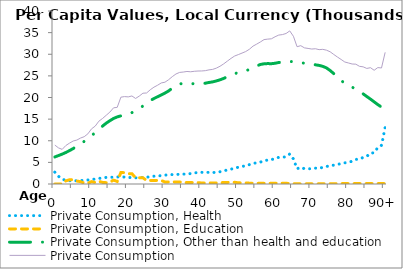
| Category | Private Consumption, Health | Private Consumption, Education | Private Consumption, Other than health and education | Private Consumption |
|---|---|---|---|---|
| 0 | 2738.482 | 0 | 6258.492 | 8996.976 |
|  | 1773.469 | 0 | 6574.999 | 8348.468 |
| 2 | 1097.007 | 0 | 6909.896 | 8006.904 |
| 3 | 880.912 | 724.705 | 7289.234 | 8894.852 |
| 4 | 746.239 | 982.514 | 7722.562 | 9451.315 |
| 5 | 746.797 | 996.976 | 8195.574 | 9939.347 |
| 6 | 756.202 | 685.112 | 8715.884 | 10157.2 |
| 7 | 807.92 | 540.49 | 9273.517 | 10621.93 |
| 8 | 856.985 | 224.862 | 9853.873 | 10935.72 |
| 9 | 934.414 | 175.884 | 10485.286 | 11595.58 |
| 10 | 1021.582 | 550.128 | 11183.636 | 12755.35 |
| 11 | 1158.002 | 348.943 | 11877.139 | 13384.08 |
| 12 | 1282.371 | 616.836 | 12630.732 | 14529.94 |
| 13 | 1393.094 | 371.239 | 13384.631 | 15148.96 |
| 14 | 1516.921 | 309.304 | 14062.706 | 15888.93 |
| 15 | 1556.655 | 436.73 | 14632.773 | 16626.15 |
| 16 | 1572.266 | 886.17 | 15154.454 | 17612.89 |
| 17 | 1618.371 | 595.545 | 15512.457 | 17726.37 |
| 18 | 1667.601 | 2647.913 | 15762.428 | 20077.95 |
| 19 | 1591.594 | 2622.589 | 15996.334 | 20210.52 |
| 20 | 1512.628 | 2391.399 | 16236.624 | 20140.65 |
| 21 | 1465.88 | 2383.916 | 16504.733 | 20354.53 |
| 22 | 1428.418 | 1433.881 | 16919.092 | 19781.39 |
| 23 | 1428.753 | 1440.181 | 17456.465 | 20325.4 |
| 24 | 1506.068 | 1453.126 | 18033.028 | 20992.23 |
| 25 | 1570.65 | 802.673 | 18673.514 | 21046.84 |
| 26 | 1673.821 | 811.946 | 19301.921 | 21787.68 |
| 27 | 1808.981 | 815.309 | 19760.299 | 22384.59 |
| 28 | 1833.968 | 822.646 | 20181.793 | 22838.41 |
| 29 | 1945.922 | 827.637 | 20592.007 | 23365.57 |
| 30 | 2050.099 | 459.611 | 21027.727 | 23537.44 |
| 31 | 2133.055 | 466.761 | 21514.245 | 24114.06 |
| 32 | 2175.983 | 472.336 | 22173.565 | 24821.88 |
| 33 | 2242.406 | 475.277 | 22721.002 | 25438.69 |
| 34 | 2203.48 | 475.051 | 23122.632 | 25801.17 |
| 35 | 2271.383 | 334.44 | 23281.138 | 25886.96 |
| 36 | 2345.505 | 335.653 | 23340.929 | 26022.08 |
| 37 | 2399.424 | 332.595 | 23214.531 | 25946.55 |
| 38 | 2564.167 | 326.375 | 23170.755 | 26061.3 |
| 39 | 2654.823 | 319.122 | 23146.319 | 26120.26 |
| 40 | 2691.353 | 231.824 | 23214.79 | 26137.96 |
| 41 | 2677.498 | 224.896 | 23303.346 | 26205.74 |
| 42 | 2685.666 | 227.704 | 23477.003 | 26390.37 |
| 43 | 2649.256 | 234.901 | 23612.256 | 26496.41 |
| 44 | 2704.886 | 253.954 | 23829.722 | 26788.57 |
| 45 | 2837.94 | 292.777 | 24088.625 | 27219.34 |
| 46 | 3026.117 | 334.372 | 24411.362 | 27771.85 |
| 47 | 3244.795 | 367.521 | 24797.475 | 28409.79 |
| 48 | 3430.148 | 392.086 | 25219.923 | 29042.16 |
| 49 | 3693.118 | 394.82 | 25510.794 | 29598.73 |
| 50 | 3872.619 | 285.023 | 25763.772 | 29921.41 |
| 51 | 4057.816 | 255.338 | 25955.123 | 30268.28 |
| 52 | 4218.014 | 226.461 | 26177.112 | 30621.59 |
| 53 | 4478.77 | 198.876 | 26474.751 | 31152.4 |
| 54 | 4787.446 | 174.309 | 26921.63 | 31883.38 |
| 55 | 4881.553 | 155.386 | 27308.112 | 32345.05 |
| 56 | 5058.373 | 146.451 | 27633.133 | 32837.96 |
| 57 | 5445.306 | 145.293 | 27794.583 | 33385.18 |
| 58 | 5510.971 | 146.192 | 27840.374 | 33497.54 |
| 59 | 5596.506 | 158.299 | 27817.469 | 33572.28 |
| 60 | 5945.464 | 178.49 | 27916.135 | 34040.09 |
| 61 | 6154.32 | 184.559 | 28090.761 | 34429.64 |
| 62 | 6163.228 | 171.378 | 28210.84 | 34545.45 |
| 63 | 6318.679 | 156.117 | 28324.552 | 34799.35 |
| 64 | 6942.022 | 127.213 | 28324.709 | 35393.94 |
| 65 | 5805.075 | 62.591 | 28287.091 | 34154.76 |
| 66 | 3522.9 | 48.056 | 28171.083 | 31742.04 |
| 67 | 3873.75 | 41.687 | 28070.008 | 31985.45 |
| 68 | 3532.188 | 37.135 | 27908.843 | 31478.16 |
| 69 | 3534.854 | 36.433 | 27773.63 | 31344.92 |
| 70 | 3519.488 | 37.729 | 27647.127 | 31204.34 |
| 71 | 3669.836 | 41.134 | 27561.028 | 31272 |
| 72 | 3597.329 | 46.259 | 27421.77 | 31065.36 |
| 73 | 3872.894 | 54.469 | 27203.445 | 31130.81 |
| 74 | 4037.59 | 64.502 | 26841.542 | 30943.63 |
| 75 | 4264.964 | 61.581 | 26244.831 | 30571.38 |
| 76 | 4355.167 | 73.25 | 25522.11 | 29950.53 |
| 77 | 4519.398 | 82.896 | 24752.44 | 29354.73 |
| 78 | 4731.104 | 91.36 | 23971.756 | 28794.22 |
| 79 | 4892.424 | 100.688 | 23216.6 | 28209.71 |
| 80 | 5028.469 | 100.688 | 22851.396 | 27980.56 |
| 81 | 5254.501 | 100.688 | 22388.176 | 27743.37 |
| 82 | 5691.103 | 100.688 | 21913.542 | 27705.33 |
| 83 | 5726.316 | 100.688 | 21382.093 | 27209.1 |
| 84 | 6154.876 | 100.688 | 20835.941 | 27091.5 |
| 85 | 6395.525 | 100.688 | 20223.881 | 26720.1 |
| 86 | 7166.356 | 100.688 | 19627.614 | 26894.66 |
| 87 | 7199.759 | 100.688 | 18994.56 | 26295.01 |
| 88 | 8456.363 | 100.688 | 18358.674 | 26915.73 |
| 89 | 8947.534 | 100.688 | 17778.339 | 26826.56 |
| 90+ | 13099.01 | 100.688 | 17238.266 | 30437.96 |